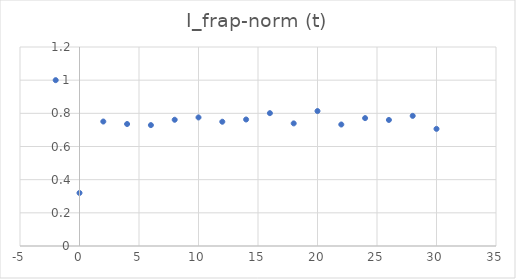
| Category | I_frap-norm (t) |
|---|---|
| -2.0 | 1 |
| 0.0 | 0.32 |
| 2.0 | 0.751 |
| 4.0 | 0.736 |
| 6.0 | 0.729 |
| 8.0 | 0.761 |
| 10.0 | 0.775 |
| 12.0 | 0.749 |
| 14.0 | 0.763 |
| 16.0 | 0.801 |
| 18.0 | 0.739 |
| 20.0 | 0.814 |
| 22.0 | 0.733 |
| 24.0 | 0.771 |
| 26.0 | 0.76 |
| 28.0 | 0.785 |
| 30.0 | 0.706 |